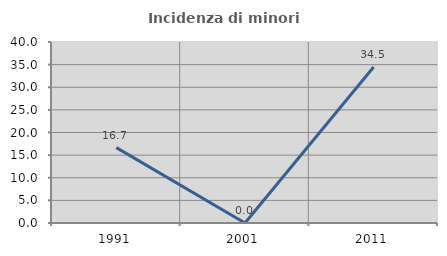
| Category | Incidenza di minori stranieri |
|---|---|
| 1991.0 | 16.667 |
| 2001.0 | 0 |
| 2011.0 | 34.483 |